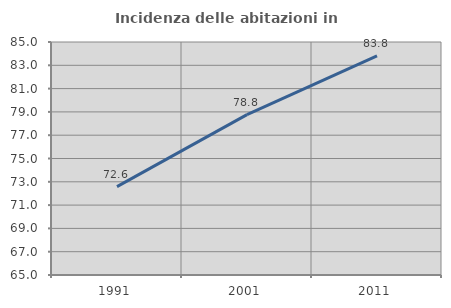
| Category | Incidenza delle abitazioni in proprietà  |
|---|---|
| 1991.0 | 72.587 |
| 2001.0 | 78.761 |
| 2011.0 | 83.813 |